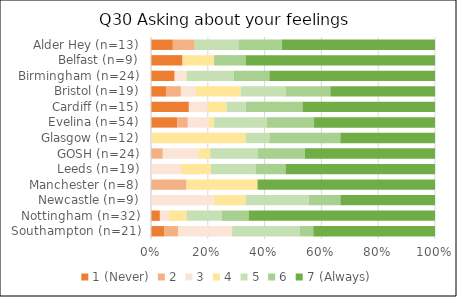
| Category | 1 (Never) | 2 | 3 | 4 | 5 | 6 | 7 (Always) |
|---|---|---|---|---|---|---|---|
| Southampton (n=21) | 1 | 1 | 4 | 0 | 5 | 1 | 9 |
| Nottingham (n=32) | 1 | 0 | 1 | 2 | 4 | 3 | 21 |
| Newcastle (n=9) | 0 | 0 | 2 | 1 | 2 | 1 | 3 |
| Manchester (n=8) | 0 | 1 | 0 | 2 | 0 | 0 | 5 |
| Leeds (n=19) | 0 | 0 | 2 | 2 | 3 | 2 | 10 |
| GOSH (n=24) | 0 | 1 | 3 | 1 | 4 | 4 | 11 |
| Glasgow (n=12) | 0 | 0 | 0 | 4 | 1 | 3 | 4 |
| Evelina (n=54) | 5 | 2 | 4 | 1 | 10 | 9 | 23 |
| Cardiff (n=15) | 2 | 0 | 1 | 1 | 1 | 3 | 7 |
| Bristol (n=19) | 1 | 1 | 1 | 3 | 3 | 3 | 7 |
| Birmingham (n=24) | 2 | 0 | 1 | 0 | 4 | 3 | 14 |
| Belfast (n=9) | 1 | 0 | 0 | 1 | 0 | 1 | 6 |
| Alder Hey (n=13) | 1 | 1 | 0 | 0 | 2 | 2 | 7 |